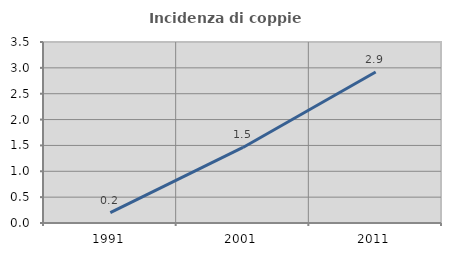
| Category | Incidenza di coppie miste |
|---|---|
| 1991.0 | 0.201 |
| 2001.0 | 1.461 |
| 2011.0 | 2.921 |